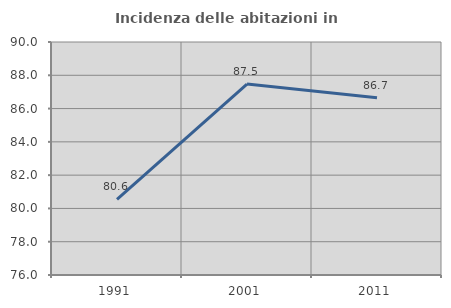
| Category | Incidenza delle abitazioni in proprietà  |
|---|---|
| 1991.0 | 80.55 |
| 2001.0 | 87.473 |
| 2011.0 | 86.651 |